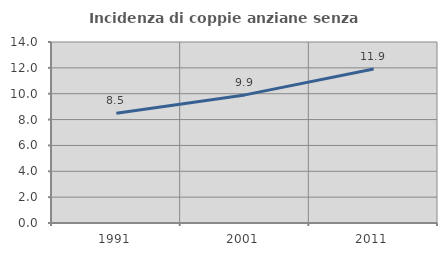
| Category | Incidenza di coppie anziane senza figli  |
|---|---|
| 1991.0 | 8.497 |
| 2001.0 | 9.909 |
| 2011.0 | 11.905 |